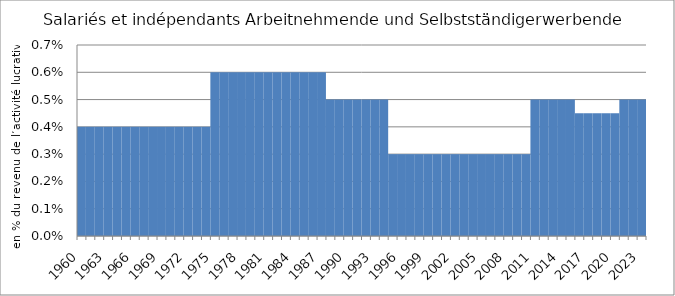
| Category | Salariés et indépendants |
|---|---|
| 1960 | 0.004 |
| 1961 | 0.004 |
| 1962 | 0.004 |
| 1963 | 0.004 |
| 1964 | 0.004 |
| 1965 | 0.004 |
| 1966 | 0.004 |
| 1967 | 0.004 |
| 1968 | 0.004 |
| 1969 | 0.004 |
| 1970 | 0.004 |
| 1971 | 0.004 |
| 1972 | 0.004 |
| 1973 | 0.004 |
| 1974 | 0.004 |
| 1975 | 0.006 |
| 1976 | 0.006 |
| 1977 | 0.006 |
| 1978 | 0.006 |
| 1979 | 0.006 |
| 1980 | 0.006 |
| 1981 | 0.006 |
| 1982 | 0.006 |
| 1983 | 0.006 |
| 1984 | 0.006 |
| 1985 | 0.006 |
| 1986 | 0.006 |
| 1987 | 0.006 |
| 1988 | 0.005 |
| 1989 | 0.005 |
| 1990 | 0.005 |
| 1991 | 0.005 |
| 1992 | 0.005 |
| 1993 | 0.005 |
| 1994 | 0.005 |
| 1995 | 0.003 |
| 1996 | 0.003 |
| 1997 | 0.003 |
| 1998 | 0.003 |
| 1999 | 0.003 |
| 2000 | 0.003 |
| 2001 | 0.003 |
| 2002 | 0.003 |
| 2003 | 0.003 |
| 2004 | 0.003 |
| 2005 | 0.003 |
| 2006 | 0.003 |
| 2007 | 0.003 |
| 2008 | 0.003 |
| 2009 | 0.003 |
| 2010 | 0.003 |
| 2011 | 0.005 |
| 2012 | 0.005 |
| 2013 | 0.005 |
| 2014 | 0.005 |
| 2015 | 0.005 |
| 2016 | 0.004 |
| 2017 | 0.004 |
| 2018 | 0.004 |
| 2019 | 0.004 |
| 2020 | 0.004 |
| 2021 | 0.005 |
| 2022 | 0.005 |
| 2023 | 0.005 |